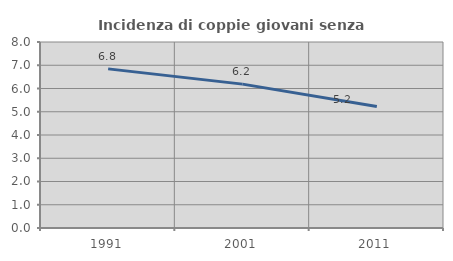
| Category | Incidenza di coppie giovani senza figli |
|---|---|
| 1991.0 | 6.844 |
| 2001.0 | 6.188 |
| 2011.0 | 5.226 |